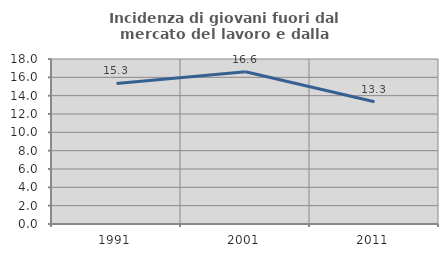
| Category | Incidenza di giovani fuori dal mercato del lavoro e dalla formazione  |
|---|---|
| 1991.0 | 15.337 |
| 2001.0 | 16.6 |
| 2011.0 | 13.343 |